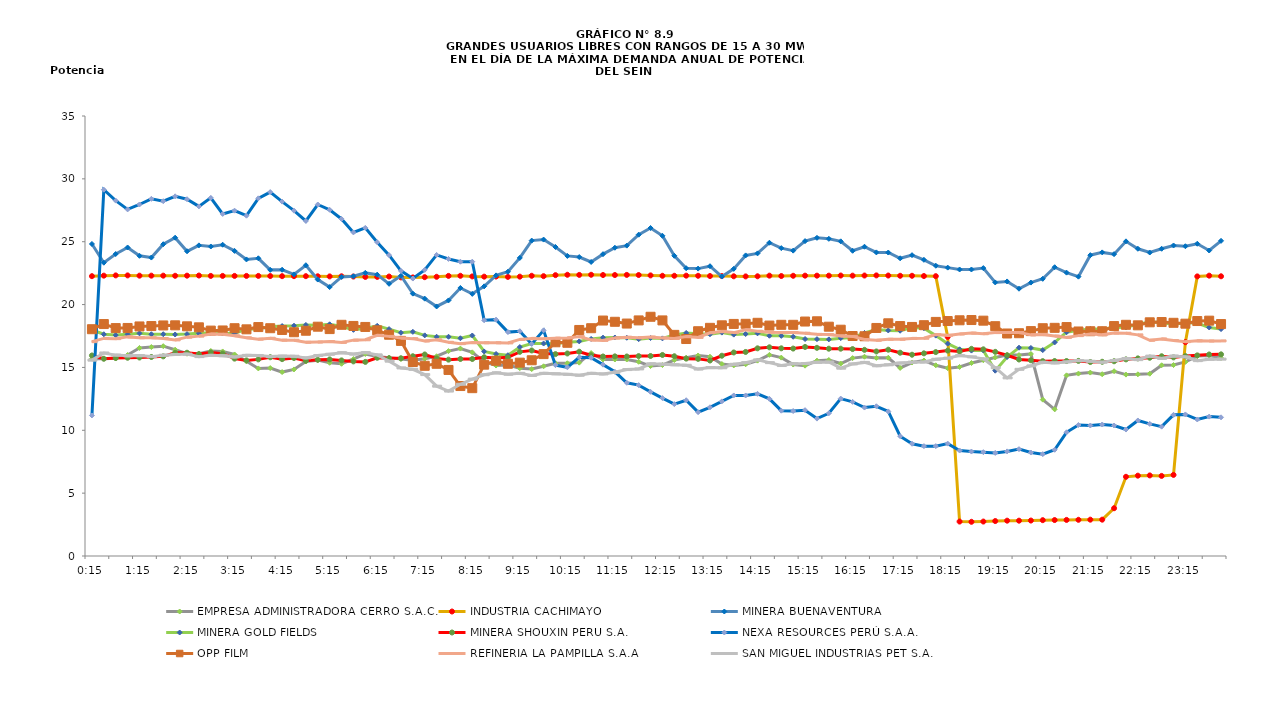
| Category | EMPRESA ADMINISTRADORA CERRO S.A.C. | INDUSTRIA CACHIMAYO | MINERA BUENAVENTURA | MINERA GOLD FIELDS | MINERA SHOUXIN PERU S.A. | NEXA RESOURCES PERÚ S.A.A. | OPP FILM | REFINERIA LA PAMPILLA S.A.A | SAN MIGUEL INDUSTRIAS PET S.A. |
|---|---|---|---|---|---|---|---|---|---|
| 2013-03-14 00:15:00 | 15.7 | 22.26 | 24.82 | 17.98 | 15.95 | 11.18 | 18.04 | 17.05 | 15.58 |
| 2013-03-14 00:30:00 | 15.7 | 22.3 | 23.33 | 17.64 | 15.69 | 29.14 | 18.45 | 17.31 | 16.15 |
| 2013-03-14 00:45:00 | 15.72 | 22.32 | 24.02 | 17.57 | 15.75 | 28.27 | 18.13 | 17.29 | 15.98 |
| 2013-03-14 01:00:00 | 15.99 | 22.32 | 24.54 | 17.63 | 15.77 | 27.57 | 18.14 | 17.43 | 15.92 |
| 2013-03-14 01:15:00 | 16.55 | 22.3 | 23.88 | 17.71 | 15.79 | 27.96 | 18.26 | 17.36 | 15.94 |
| 2013-03-14 01:30:00 | 16.62 | 22.3 | 23.74 | 17.64 | 15.83 | 28.41 | 18.29 | 17.36 | 15.86 |
| 2013-03-14 01:45:00 | 16.69 | 22.3 | 24.8 | 17.64 | 15.88 | 28.22 | 18.34 | 17.3 | 15.97 |
| 2013-03-14 02:00:00 | 16.41 | 22.29 | 25.32 | 17.62 | 16.16 | 28.61 | 18.35 | 17.19 | 16.03 |
| 2013-03-14 02:15:00 | 16.09 | 22.3 | 24.24 | 17.65 | 16.17 | 28.38 | 18.27 | 17.41 | 16.06 |
| 2013-03-14 02:30:00 | 16.09 | 22.31 | 24.71 | 17.72 | 16.06 | 27.81 | 18.19 | 17.49 | 15.86 |
| 2013-03-14 02:45:00 | 16.31 | 22.28 | 24.62 | 17.76 | 16.19 | 28.49 | 17.93 | 17.65 | 15.96 |
| 2013-03-14 03:00:00 | 16.27 | 22.28 | 24.76 | 17.7 | 16.1 | 27.21 | 17.94 | 17.64 | 15.93 |
| 2013-03-14 03:15:00 | 16.03 | 22.28 | 24.27 | 17.71 | 15.7 | 27.47 | 18.12 | 17.52 | 15.83 |
| 2013-03-14 03:30:00 | 15.49 | 22.28 | 23.59 | 18.04 | 15.56 | 27.07 | 18.03 | 17.36 | 15.96 |
| 2013-03-14 03:45:00 | 14.92 | 22.28 | 23.68 | 18.07 | 15.64 | 28.45 | 18.21 | 17.25 | 15.95 |
| 2013-03-14 04:00:00 | 14.95 | 22.27 | 22.76 | 18.24 | 15.81 | 28.95 | 18.12 | 17.32 | 15.86 |
| 2013-03-14 04:15:00 | 14.63 | 22.26 | 22.77 | 18.29 | 15.66 | 28.19 | 17.98 | 17.17 | 15.9 |
| 2013-03-14 04:30:00 | 14.84 | 22.26 | 22.4 | 18.32 | 15.75 | 27.47 | 17.8 | 17.16 | 15.89 |
| 2013-03-14 04:45:00 | 15.48 | 22.26 | 23.13 | 18.38 | 15.53 | 26.65 | 17.92 | 17 | 15.76 |
| 2013-03-14 05:00:00 | 15.58 | 22.25 | 21.99 | 18.36 | 15.61 | 27.96 | 18.24 | 17.02 | 15.95 |
| 2013-03-14 05:15:00 | 15.37 | 22.24 | 21.39 | 18.43 | 15.64 | 27.54 | 18.05 | 17.06 | 16.05 |
| 2013-03-14 05:30:00 | 15.29 | 22.25 | 22.2 | 18.25 | 15.56 | 26.81 | 18.39 | 16.99 | 16.17 |
| 2013-03-14 05:45:00 | 15.67 | 22.23 | 22.25 | 17.99 | 15.48 | 25.74 | 18.3 | 17.17 | 16.06 |
| 2013-03-14 06:00:00 | 16.07 | 22.2 | 22.52 | 18.1 | 15.44 | 26.1 | 18.22 | 17.2 | 16.18 |
| 2013-03-14 06:15:00 | 15.87 | 22.2 | 22.38 | 18.31 | 15.77 | 24.96 | 17.95 | 17.55 | 16 |
| 2013-03-14 06:30:00 | 15.78 | 22.23 | 21.65 | 18.05 | 15.73 | 23.93 | 17.6 | 17.47 | 15.5 |
| 2013-03-14 06:45:00 | 15.67 | 22.16 | 22.29 | 17.76 | 15.73 | 22.68 | 17.11 | 17.34 | 14.96 |
| 2013-03-14 07:00:00 | 15.57 | 22.16 | 20.87 | 17.83 | 15.89 | 22.07 | 15.43 | 17.29 | 14.85 |
| 2013-03-14 07:15:00 | 15.69 | 22.18 | 20.47 | 17.55 | 16.03 | 22.76 | 15.13 | 17.1 | 14.43 |
| 2013-03-14 07:30:00 | 15.89 | 22.21 | 19.85 | 17.44 | 15.72 | 23.95 | 15.29 | 17.2 | 13.51 |
| 2013-03-14 07:45:00 | 16.3 | 22.28 | 20.33 | 17.44 | 15.62 | 23.63 | 14.8 | 17 | 13.12 |
| 2013-03-14 08:00:00 | 16.5 | 22.29 | 21.32 | 17.32 | 15.67 | 23.41 | 13.52 | 16.89 | 13.66 |
| 2013-03-14 08:15:00 | 16.2 | 22.24 | 20.85 | 17.54 | 15.67 | 23.41 | 13.35 | 16.98 | 14.07 |
| 2013-03-14 08:30:00 | 15.46 | 22.22 | 21.45 | 16.27 | 15.81 | 18.75 | 15.22 | 16.96 | 14.42 |
| 2013-03-14 08:45:00 | 15.15 | 22.23 | 22.32 | 16.07 | 15.76 | 18.8 | 15.53 | 16.96 | 14.57 |
| 2013-03-14 09:00:00 | 15.19 | 22.2 | 22.61 | 15.97 | 15.8 | 17.81 | 15.29 | 16.95 | 14.46 |
| 2013-03-14 09:15:00 | 14.94 | 22.22 | 23.71 | 16.62 | 16.24 | 17.88 | 15.38 | 17.23 | 14.53 |
| 2013-03-14 09:30:00 | 14.87 | 22.29 | 25.09 | 16.9 | 16.35 | 16.87 | 15.57 | 17.31 | 14.36 |
| 2013-03-14 09:45:00 | 15.09 | 22.26 | 25.17 | 16.9 | 16.11 | 17.95 | 16.06 | 17.28 | 14.53 |
| 2013-03-14 10:00:00 | 15.33 | 22.34 | 24.58 | 16.88 | 16.06 | 15.18 | 17 | 17.33 | 14.49 |
| 2013-03-14 10:15:00 | 15.33 | 22.37 | 23.87 | 17.01 | 16.11 | 15.01 | 16.96 | 17.35 | 14.45 |
| 2013-03-14 10:30:00 | 15.38 | 22.36 | 23.78 | 17.07 | 16.25 | 15.81 | 17.98 | 17.46 | 14.38 |
| 2013-03-14 10:45:00 | 16.14 | 22.37 | 23.39 | 17.27 | 15.97 | 15.77 | 18.12 | 17.19 | 14.53 |
| 2013-03-14 11:00:00 | 15.63 | 22.35 | 24.01 | 17.37 | 15.87 | 15.22 | 18.73 | 17.15 | 14.48 |
| 2013-03-14 11:15:00 | 15.63 | 22.35 | 24.52 | 17.38 | 15.88 | 14.65 | 18.63 | 17.34 | 14.61 |
| 2013-03-14 11:30:00 | 15.63 | 22.36 | 24.69 | 17.36 | 15.87 | 13.78 | 18.49 | 17.4 | 14.83 |
| 2013-03-14 11:45:00 | 15.45 | 22.35 | 25.56 | 17.25 | 15.9 | 13.59 | 18.74 | 17.36 | 14.88 |
| 2013-03-14 12:00:00 | 15.11 | 22.32 | 26.09 | 17.34 | 15.91 | 13.06 | 19.03 | 17.42 | 15.29 |
| 2013-03-14 12:15:00 | 15.19 | 22.29 | 25.47 | 17.31 | 15.99 | 12.56 | 18.74 | 17.35 | 15.26 |
| 2013-03-14 12:30:00 | 15.59 | 22.29 | 23.88 | 17.59 | 15.89 | 12.08 | 17.59 | 17.3 | 15.21 |
| 2013-03-14 12:45:00 | 15.77 | 22.3 | 22.89 | 17.74 | 15.7 | 12.39 | 17.26 | 17.46 | 15.17 |
| 2013-03-14 13:00:00 | 15.95 | 22.29 | 22.86 | 17.68 | 15.68 | 11.44 | 17.88 | 17.39 | 14.87 |
| 2013-03-14 13:15:00 | 15.85 | 22.27 | 23.05 | 17.64 | 15.55 | 11.83 | 18.15 | 17.76 | 14.99 |
| 2013-03-14 13:30:00 | 15.27 | 22.27 | 22.23 | 17.77 | 15.93 | 12.3 | 18.35 | 17.86 | 14.97 |
| 2013-03-14 13:45:00 | 15.16 | 22.25 | 22.84 | 17.61 | 16.19 | 12.77 | 18.46 | 17.77 | 15.25 |
| 2013-03-14 14:00:00 | 15.25 | 22.24 | 23.91 | 17.66 | 16.23 | 12.77 | 18.47 | 17.99 | 15.38 |
| 2013-03-14 14:15:00 | 15.54 | 22.25 | 24.07 | 17.71 | 16.52 | 12.9 | 18.55 | 17.88 | 15.6 |
| 2013-03-14 14:30:00 | 16 | 22.3 | 24.92 | 17.52 | 16.6 | 12.5 | 18.33 | 17.8 | 15.38 |
| 2013-03-14 14:45:00 | 15.78 | 22.27 | 24.49 | 17.51 | 16.52 | 11.56 | 18.39 | 17.77 | 15.15 |
| 2013-03-14 15:00:00 | 15.23 | 22.29 | 24.29 | 17.44 | 16.5 | 11.53 | 18.39 | 17.77 | 15.29 |
| 2013-03-14 15:15:00 | 15.14 | 22.3 | 25.05 | 17.26 | 16.63 | 11.6 | 18.65 | 17.72 | 15.31 |
| 2013-03-14 15:30:00 | 15.54 | 22.3 | 25.31 | 17.25 | 16.56 | 10.93 | 18.67 | 17.63 | 15.41 |
| 2013-03-14 15:45:00 | 15.59 | 22.3 | 25.23 | 17.23 | 16.49 | 11.35 | 18.24 | 17.61 | 15.43 |
| 2013-03-14 16:00:00 | 15.31 | 22.31 | 25.03 | 17.33 | 16.49 | 12.52 | 18 | 17.5 | 14.94 |
| 2013-03-14 16:15:00 | 15.74 | 22.3 | 24.28 | 17.37 | 16.46 | 12.26 | 17.5 | 17.47 | 15.28 |
| 2013-03-14 16:30:00 | 15.85 | 22.31 | 24.6 | 17.74 | 16.4 | 11.81 | 17.48 | 17.22 | 15.4 |
| 2013-03-14 16:45:00 | 15.76 | 22.32 | 24.15 | 18.01 | 16.27 | 11.91 | 18.14 | 17.16 | 15.13 |
| 2013-03-14 17:00:00 | 15.77 | 22.31 | 24.14 | 17.94 | 16.41 | 11.5 | 18.51 | 17.24 | 15.21 |
| 2013-03-14 17:15:00 | 14.96 | 22.29 | 23.68 | 17.92 | 16.17 | 9.53 | 18.29 | 17.24 | 15.35 |
| 2013-03-14 17:30:00 | 15.39 | 22.29 | 23.93 | 18.18 | 16.01 | 8.93 | 18.22 | 17.31 | 15.42 |
| 2013-03-14 17:45:00 | 15.55 | 22.27 | 23.56 | 18.12 | 16.12 | 8.74 | 18.36 | 17.32 | 15.43 |
| 2013-03-14 18:00:00 | 15.17 | 22.26 | 23.09 | 17.53 | 16.22 | 8.74 | 18.62 | 17.61 | 15.65 |
| 2013-03-14 18:15:00 | 14.94 | 17.43 | 22.94 | 16.89 | 16.34 | 8.94 | 18.69 | 17.55 | 15.74 |
| 2013-03-14 18:30:00 | 15.04 | 2.74 | 22.79 | 16.44 | 16.26 | 8.39 | 18.75 | 17.66 | 15.94 |
| 2013-03-14 18:45:00 | 15.35 | 2.72 | 22.79 | 16.34 | 16.48 | 8.31 | 18.77 | 17.73 | 15.84 |
| 2013-03-14 19:00:00 | 15.57 | 2.74 | 22.9 | 16.35 | 16.44 | 8.26 | 18.72 | 17.68 | 15.68 |
| 2013-03-14 19:15:00 | 15.79 | 2.78 | 21.76 | 14.74 | 16.24 | 8.2 | 18.28 | 17.77 | 14.98 |
| 2013-03-14 19:30:00 | 15.98 | 2.81 | 21.84 | 15.83 | 15.97 | 8.32 | 17.7 | 17.78 | 14.17 |
| 2013-03-14 19:45:00 | 15.98 | 2.81 | 21.26 | 16.57 | 15.63 | 8.5 | 17.72 | 17.77 | 14.85 |
| 2013-03-14 20:00:00 | 16.07 | 2.82 | 21.75 | 16.55 | 15.57 | 8.23 | 17.89 | 17.59 | 15.12 |
| 2013-03-14 20:15:00 | 12.44 | 2.85 | 22.05 | 16.38 | 15.5 | 8.1 | 18.12 | 17.61 | 15.41 |
| 2013-03-14 20:30:00 | 11.67 | 2.86 | 22.97 | 16.99 | 15.51 | 8.45 | 18.15 | 17.5 | 15.36 |
| 2013-03-14 20:45:00 | 14.37 | 2.87 | 22.54 | 17.8 | 15.51 | 9.84 | 18.21 | 17.39 | 15.44 |
| 2013-03-14 21:00:00 | 14.51 | 2.88 | 22.22 | 17.96 | 15.52 | 10.42 | 17.86 | 17.53 | 15.55 |
| 2013-03-14 21:15:00 | 14.59 | 2.89 | 23.93 | 18.06 | 15.43 | 10.38 | 17.88 | 17.66 | 15.49 |
| 2013-03-14 21:30:00 | 14.46 | 2.89 | 24.15 | 18.03 | 15.45 | 10.46 | 17.88 | 17.6 | 15.42 |
| 2013-03-14 21:45:00 | 14.7 | 3.8 | 24.01 | 18.18 | 15.49 | 10.38 | 18.29 | 17.74 | 15.55 |
| 2013-03-14 22:00:00 | 14.43 | 6.3 | 25.03 | 18.19 | 15.64 | 10.06 | 18.39 | 17.72 | 15.71 |
| 2013-03-14 22:15:00 | 14.45 | 6.39 | 24.44 | 18.43 | 15.72 | 10.78 | 18.35 | 17.59 | 15.62 |
| 2013-03-14 22:30:00 | 14.5 | 6.41 | 24.14 | 18.61 | 15.77 | 10.51 | 18.59 | 17.16 | 15.9 |
| 2013-03-14 22:45:00 | 15.17 | 6.37 | 24.44 | 18.57 | 15.89 | 10.29 | 18.61 | 17.27 | 15.72 |
| 2013-03-14 23:00:00 | 15.19 | 6.45 | 24.7 | 18.42 | 15.8 | 11.23 | 18.55 | 17.14 | 15.91 |
| 2013-03-14 23:15:00 | 15.44 | 17.01 | 24.64 | 18.58 | 15.9 | 11.26 | 18.48 | 17.05 | 15.84 |
| 2013-03-14 23:30:00 | 15.9 | 22.24 | 24.84 | 18.52 | 15.96 | 10.86 | 18.69 | 17.12 | 15.54 |
| 2013-03-14 23:45:00 | 15.94 | 22.3 | 24.3 | 18.18 | 16.03 | 11.09 | 18.72 | 17.1 | 15.65 |
| 2013-03-15 | 15.75 | 22.25 | 25.07 | 18.05 | 16.04 | 11.03 | 18.45 | 17.11 | 15.66 |